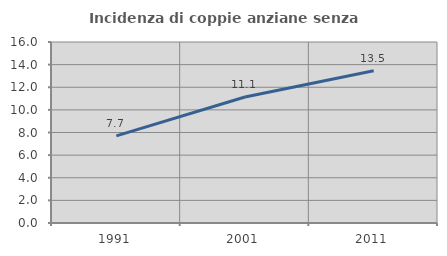
| Category | Incidenza di coppie anziane senza figli  |
|---|---|
| 1991.0 | 7.702 |
| 2001.0 | 11.135 |
| 2011.0 | 13.451 |